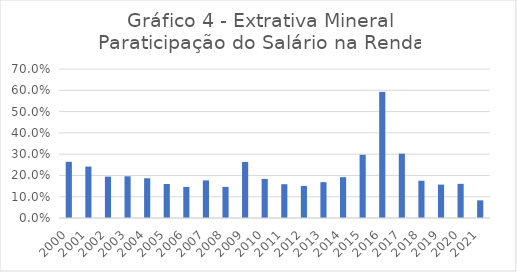
| Category | EXTRATIVA MINERAL |
|---|---|
| 2000.0 | 0.264 |
| 2001.0 | 0.242 |
| 2002.0 | 0.194 |
| 2003.0 | 0.196 |
| 2004.0 | 0.187 |
| 2005.0 | 0.16 |
| 2006.0 | 0.146 |
| 2007.0 | 0.177 |
| 2008.0 | 0.146 |
| 2009.0 | 0.263 |
| 2010.0 | 0.184 |
| 2011.0 | 0.159 |
| 2012.0 | 0.15 |
| 2013.0 | 0.168 |
| 2014.0 | 0.192 |
| 2015.0 | 0.297 |
| 2016.0 | 0.592 |
| 2017.0 | 0.302 |
| 2018.0 | 0.175 |
| 2019.0 | 0.157 |
| 2020.0 | 0.16 |
| 2021.0 | 0.083 |